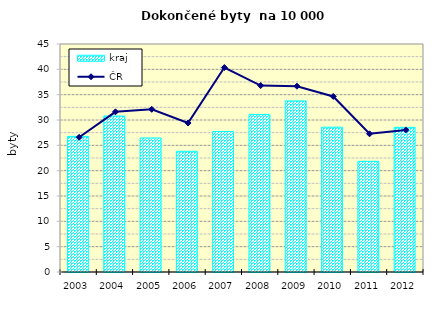
| Category | kraj |
|---|---|
| 2003.0 | 26.762 |
| 2004.0 | 30.791 |
| 2005.0 | 26.455 |
| 2006.0 | 23.825 |
| 2007.0 | 27.724 |
| 2008.0 | 31.093 |
| 2009.0 | 33.772 |
| 2010.0 | 28.579 |
| 2011.0 | 21.843 |
| 2012.0 | 28.546 |